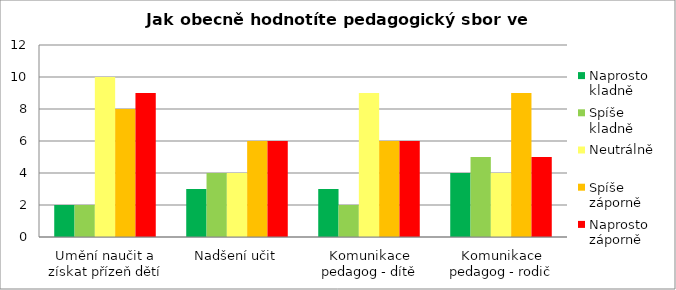
| Category | Naprosto
kladně | Spíše
kladně | Neutrálně | Spíše
záporně | Naprosto
záporně |
|---|---|---|---|---|---|
| Umění naučit a získat přízeň dětí | 2 | 2 | 10 | 8 | 9 |
| Nadšení učit | 3 | 4 | 4 | 6 | 6 |
| Komunikace pedagog - dítě | 3 | 2 | 9 | 6 | 6 |
| Komunikace pedagog - rodič | 4 | 5 | 4 | 9 | 5 |